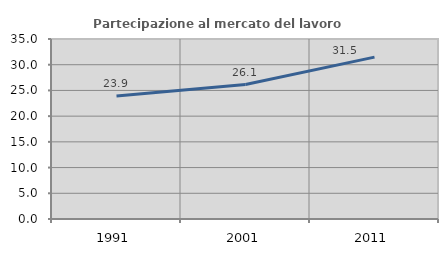
| Category | Partecipazione al mercato del lavoro  femminile |
|---|---|
| 1991.0 | 23.907 |
| 2001.0 | 26.149 |
| 2011.0 | 31.473 |